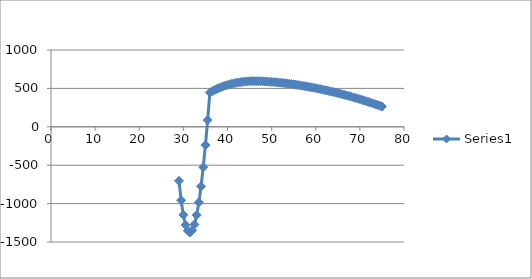
| Category | Series 0 |
|---|---|
| 75.0 | 264.1 |
| 74.5 | 274.345 |
| 74.0 | 284.412 |
| 73.5 | 294.305 |
| 73.0 | 304.026 |
| 72.5 | 313.578 |
| 72.0 | 322.964 |
| 71.5 | 332.186 |
| 71.0 | 341.248 |
| 70.5 | 350.15 |
| 70.0 | 358.896 |
| 69.5 | 367.487 |
| 69.0 | 375.925 |
| 68.5 | 384.212 |
| 68.0 | 392.349 |
| 67.5 | 400.338 |
| 67.0 | 408.179 |
| 66.5 | 415.875 |
| 66.0 | 423.425 |
| 65.5 | 430.831 |
| 65.0 | 438.093 |
| 64.5 | 445.211 |
| 64.0 | 452.187 |
| 63.5 | 459.02 |
| 63.0 | 465.71 |
| 62.5 | 472.257 |
| 62.0 | 478.661 |
| 61.5 | 484.921 |
| 61.0 | 491.037 |
| 60.5 | 497.007 |
| 60.0 | 502.832 |
| 59.5 | 508.508 |
| 59.0 | 514.037 |
| 58.5 | 519.414 |
| 58.0 | 524.639 |
| 57.5 | 529.71 |
| 57.0 | 534.624 |
| 56.5 | 539.379 |
| 56.0 | 543.972 |
| 55.5 | 548.399 |
| 55.0 | 552.658 |
| 54.5 | 556.745 |
| 54.0 | 560.655 |
| 53.5 | 564.384 |
| 53.0 | 567.928 |
| 52.5 | 571.281 |
| 52.0 | 574.438 |
| 51.5 | 577.392 |
| 51.0 | 580.137 |
| 50.5 | 582.666 |
| 50.0 | 584.972 |
| 49.5 | 587.046 |
| 49.0 | 588.878 |
| 48.5 | 590.461 |
| 48.0 | 591.782 |
| 47.5 | 592.832 |
| 47.0 | 593.597 |
| 46.5 | 594.065 |
| 46.0 | 594.201 |
| 45.5 | 593.791 |
| 45.0 | 592.769 |
| 44.5 | 591.121 |
| 44.0 | 588.83 |
| 43.5 | 585.878 |
| 43.0 | 582.248 |
| 42.5 | 577.92 |
| 42.0 | 572.874 |
| 41.5 | 567.087 |
| 41.0 | 560.537 |
| 40.5 | 553.199 |
| 40.0 | 545.047 |
| 39.5 | 536.054 |
| 39.0 | 526.191 |
| 38.5 | 515.426 |
| 38.0 | 503.728 |
| 37.5 | 491.062 |
| 37.0 | 477.39 |
| 36.5 | 462.674 |
| 36.0 | 446.873 |
| 35.5 | 87.492 |
| 35.0 | -237.645 |
| 34.5 | -525.547 |
| 34.0 | -774.668 |
| 33.5 | -983.354 |
| 33.0 | -1149.833 |
| 32.5 | -1272.211 |
| 32.0 | -1348.457 |
| 31.5 | -1376.395 |
| 31.0 | -1353.693 |
| 30.5 | -1277.848 |
| 30.0 | -1146.171 |
| 29.5 | -955.775 |
| 29.0 | -703.553 |